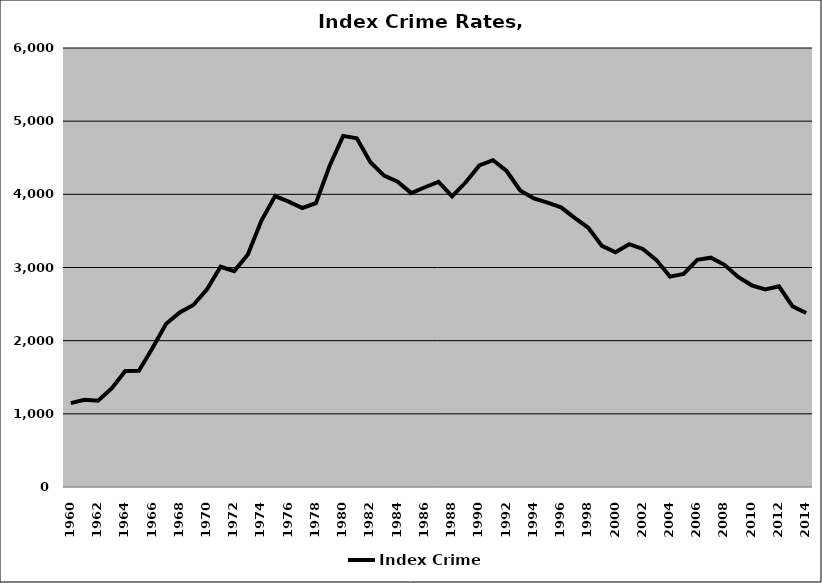
| Category | Index Crime |
|---|---|
| 1960.0 | 1145.561 |
| 1961.0 | 1191.87 |
| 1962.0 | 1178.201 |
| 1963.0 | 1347.008 |
| 1964.0 | 1585.342 |
| 1965.0 | 1588.924 |
| 1966.0 | 1899.519 |
| 1967.0 | 2232.132 |
| 1968.0 | 2386.281 |
| 1969.0 | 2488.07 |
| 1970.0 | 2702.078 |
| 1971.0 | 3010.21 |
| 1972.0 | 2950.929 |
| 1973.0 | 3176.866 |
| 1974.0 | 3641.13 |
| 1975.0 | 3975.624 |
| 1976.0 | 3900.673 |
| 1977.0 | 3813.416 |
| 1978.0 | 3880.231 |
| 1979.0 | 4387.966 |
| 1980.0 | 4798.611 |
| 1981.0 | 4766.85 |
| 1982.0 | 4439.119 |
| 1983.0 | 4255.694 |
| 1984.0 | 4172.283 |
| 1985.0 | 4016.712 |
| 1986.0 | 4096.782 |
| 1987.0 | 4169.44 |
| 1988.0 | 3971.984 |
| 1989.0 | 4164.845 |
| 1990.0 | 4395.138 |
| 1991.0 | 4465.853 |
| 1992.0 | 4319.033 |
| 1993.0 | 4054.069 |
| 1994.0 | 3944.353 |
| 1995.0 | 3885.692 |
| 1996.0 | 3821.357 |
| 1997.0 | 3677.621 |
| 1998.0 | 3543.128 |
| 1999.0 | 3296.139 |
| 2000.0 | 3209.068 |
| 2001.0 | 3318.752 |
| 2002.0 | 3253.622 |
| 2003.0 | 3101.553 |
| 2004.0 | 2875.571 |
| 2005.0 | 2911.24 |
| 2006.0 | 3105.783 |
| 2007.0 | 3134.207 |
| 2008.0 | 3036.724 |
| 2009.0 | 2870.884 |
| 2010.0 | 2756.363 |
| 2011.0 | 2700.249 |
| 2012.0 | 2743.166 |
| 2013.0 | 2469.322 |
| 2014.0 | 2378.645 |